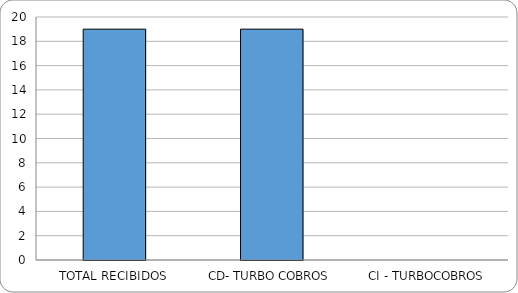
| Category | Series 0 |
|---|---|
| TOTAL RECIBIDOS | 19 |
| CD- TURBO COBROS | 19 |
| CI - TURBOCOBROS | 0 |